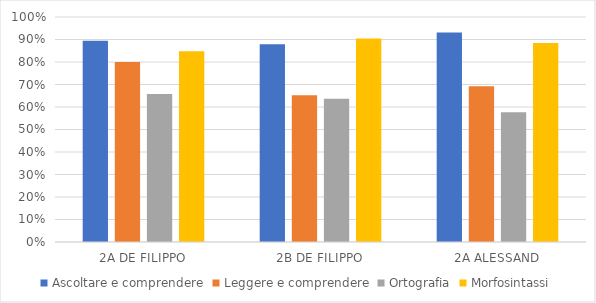
| Category | Ascoltare e comprendere | Leggere e comprendere | Ortografia | Morfosintassi |
|---|---|---|---|---|
| 2A DE FILIPPO | 0.895 | 0.8 | 0.658 | 0.847 |
| 2B DE FILIPPO | 0.879 | 0.653 | 0.637 | 0.904 |
| 2A ALESSAND | 0.931 | 0.692 | 0.577 | 0.885 |